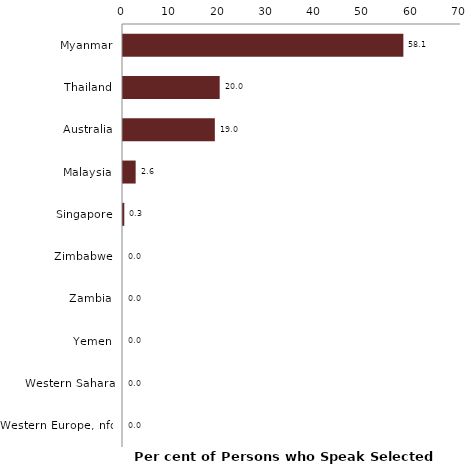
| Category | Series 0 |
|---|---|
| Myanmar | 58.065 |
| Thailand | 20.027 |
| Australia | 19.019 |
| Malaysia | 2.621 |
| Singapore | 0.269 |
| Zimbabwe | 0 |
| Zambia | 0 |
| Yemen | 0 |
| Western Sahara | 0 |
| Western Europe, nfd | 0 |